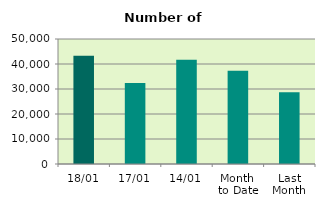
| Category | Series 0 |
|---|---|
| 18/01 | 43326 |
| 17/01 | 32436 |
| 14/01 | 41654 |
| Month 
to Date | 37250.833 |
| Last
Month | 28724.435 |